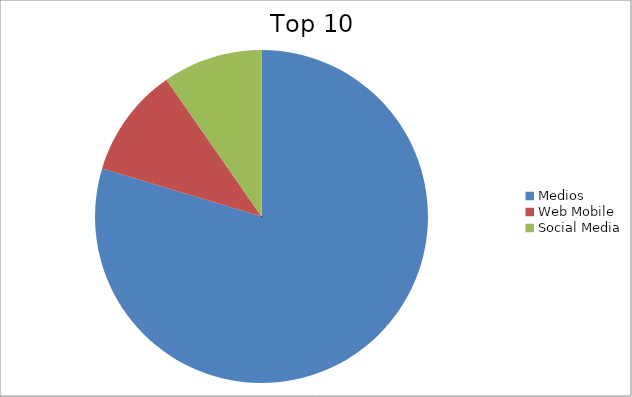
| Category | Series 0 |
|---|---|
| Medios | 79.66 |
| Web Mobile | 10.66 |
| Social Media | 9.68 |